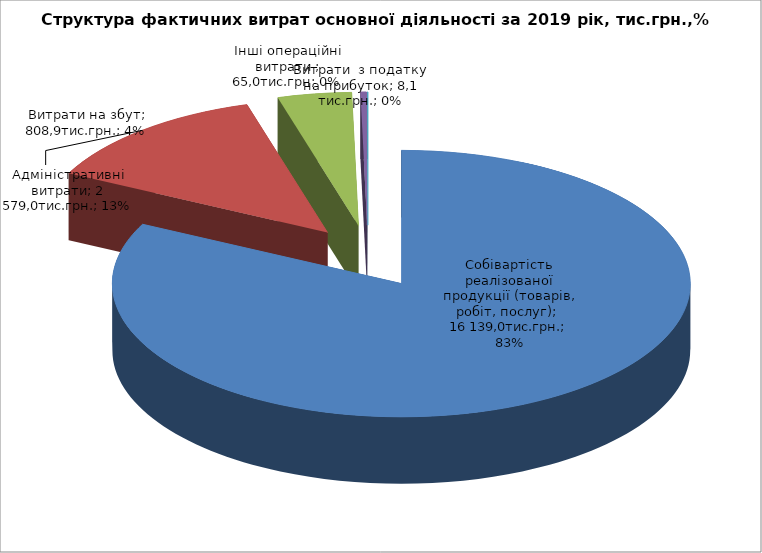
| Category | Series 0 |
|---|---|
| Собівартість реалізованої продукції (товарів, робіт, послуг) | 16139 |
| Адміністративні витрати | 2578.967 |
| Витрати на збут | 808.9 |
| Інші операційні витрати  | 65 |
| Витрати  з податку на прибуток | 8.124 |